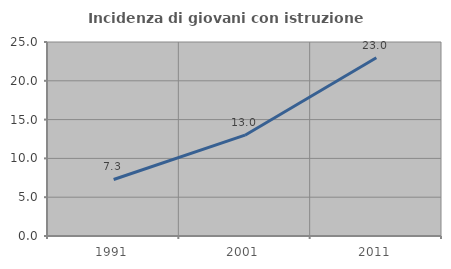
| Category | Incidenza di giovani con istruzione universitaria |
|---|---|
| 1991.0 | 7.285 |
| 2001.0 | 12.991 |
| 2011.0 | 22.972 |